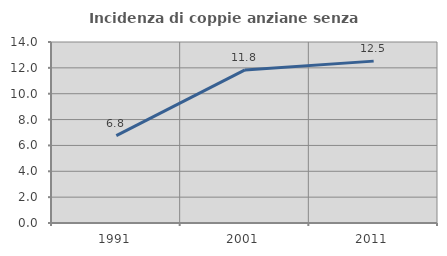
| Category | Incidenza di coppie anziane senza figli  |
|---|---|
| 1991.0 | 6.761 |
| 2001.0 | 11.839 |
| 2011.0 | 12.521 |